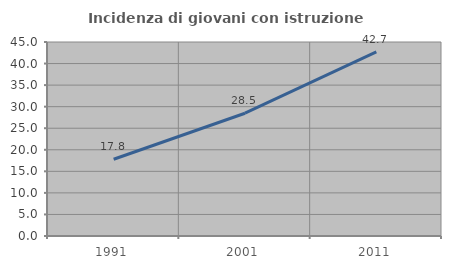
| Category | Incidenza di giovani con istruzione universitaria |
|---|---|
| 1991.0 | 17.798 |
| 2001.0 | 28.48 |
| 2011.0 | 42.697 |